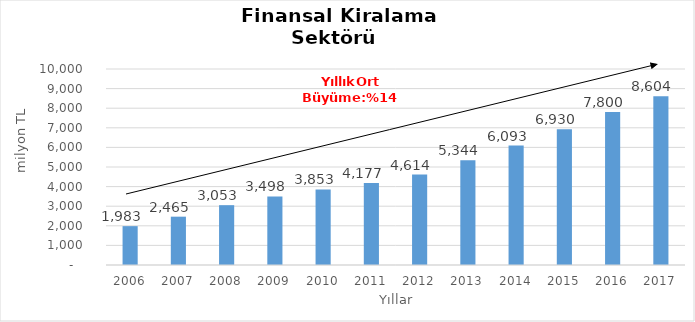
| Category | Finansal Kiralama  |
|---|---|
| 2006.0 | 1982.831 |
| 2007.0 | 2465.488 |
| 2008.0 | 3052.714 |
| 2009.0 | 3497.62 |
| 2010.0 | 3853.173 |
| 2011.0 | 4177.309 |
| 2012.0 | 4614.29 |
| 2013.0 | 5344.41 |
| 2014.0 | 6093 |
| 2015.0 | 6930 |
| 2016.0 | 7800 |
| 2017.0 | 8604 |